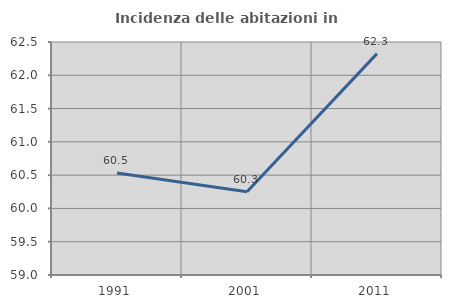
| Category | Incidenza delle abitazioni in proprietà  |
|---|---|
| 1991.0 | 60.533 |
| 2001.0 | 60.25 |
| 2011.0 | 62.326 |